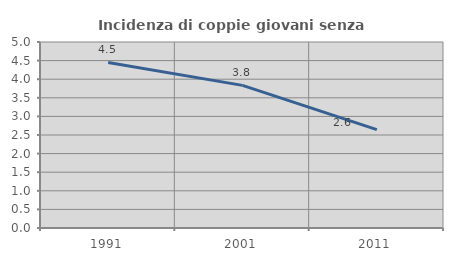
| Category | Incidenza di coppie giovani senza figli |
|---|---|
| 1991.0 | 4.451 |
| 2001.0 | 3.834 |
| 2011.0 | 2.642 |